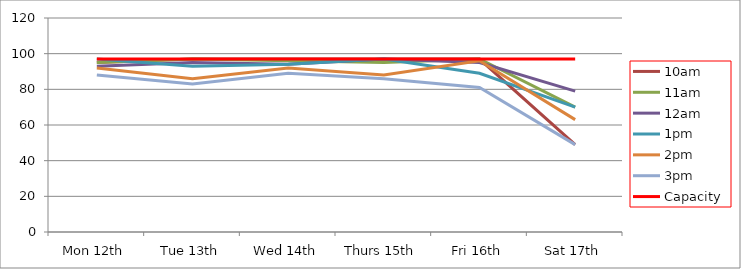
| Category | 9am | 10am | 11am | 12am | 1pm | 2pm | 3pm | 4pm | 5pm | Capacity |
|---|---|---|---|---|---|---|---|---|---|---|
| Mon 12th |  | 95 | 95 | 93 | 97 | 92 | 88 |  |  | 97 |
| Tue 13th |  | 97 | 97 | 95 | 93 | 86 | 83 |  |  | 97 |
| Wed 14th |  | 97 | 96 | 94 | 94 | 92 | 89 |  |  | 97 |
| Thurs 15th |  | 97 | 95 | 97 | 97 | 88 | 86 |  |  | 97 |
| Fri 16th |  | 97 | 97 | 95 | 89 | 96 | 81 |  |  | 97 |
| Sat 17th |  | 49 | 70 | 79 | 70 | 63 | 49 |  |  | 97 |